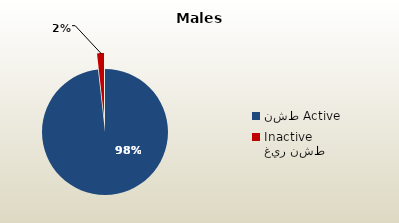
| Category | الذكور غير القطريين  Non-Qatari Males |
|---|---|
| نشط Active | 1657237 |
| غير نشط Inactive | 29838 |